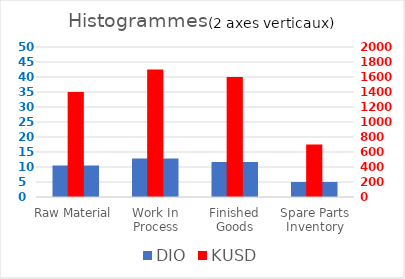
| Category | DIO |
|---|---|
| Raw Material | 10.461 |
| Work In Process | 12.809 |
| Finished Goods | 11.693 |
| Spare Parts Inventory | 5.012 |